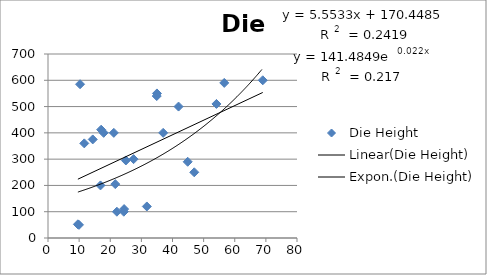
| Category | Die Height |
|---|---|
| 9.95 | 50 |
| 24.45 | 110 |
| 31.75 | 120 |
| 35.0 | 550 |
| 25.02 | 295 |
| 16.86 | 200 |
| 14.38 | 375 |
| 9.6 | 52 |
| 24.35 | 100 |
| 27.5 | 300 |
| 17.08 | 412 |
| 37.0 | 400 |
| 41.95 | 500 |
| 11.66 | 360 |
| 21.62 | 205 |
| 17.89 | 400 |
| 69.0 | 600 |
| 10.3 | 585 |
| 34.93 | 540 |
| 46.99 | 250 |
| 44.88 | 290 |
| 54.12 | 510 |
| 56.63 | 590 |
| 22.13 | 100 |
| 21.15 | 400 |